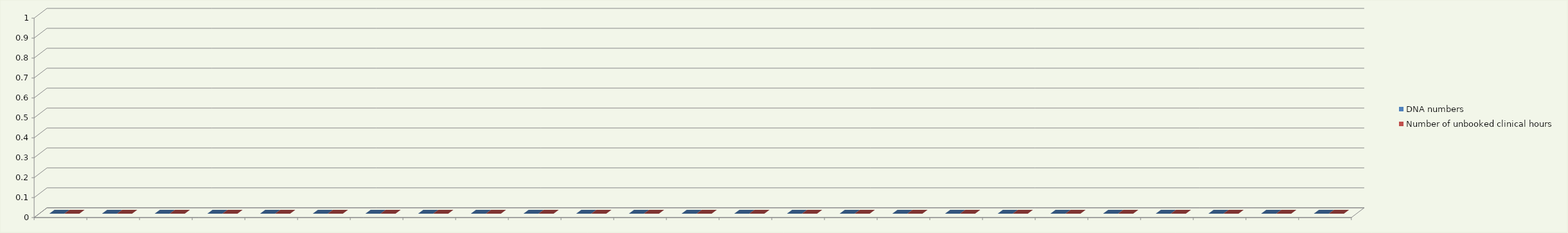
| Category | DNA numbers | Number of unbooked clinical hours |
|---|---|---|
| 0 | 0 | 0 |
| 1 | 0 | 0 |
| 2 | 0 | 0 |
| 3 | 0 | 0 |
| 4 | 0 | 0 |
| 5 | 0 | 0 |
| 6 | 0 | 0 |
| 7 | 0 | 0 |
| 8 | 0 | 0 |
| 9 | 0 | 0 |
| 10 | 0 | 0 |
| 11 | 0 | 0 |
| 12 | 0 | 0 |
| 13 | 0 | 0 |
| 14 | 0 | 0 |
| 15 | 0 | 0 |
| 16 | 0 | 0 |
| 17 | 0 | 0 |
| 18 | 0 | 0 |
| 19 | 0 | 0 |
| 20 | 0 | 0 |
| 21 | 0 | 0 |
| 22 | 0 | 0 |
| 23 | 0 | 0 |
| 24 | 0 | 0 |